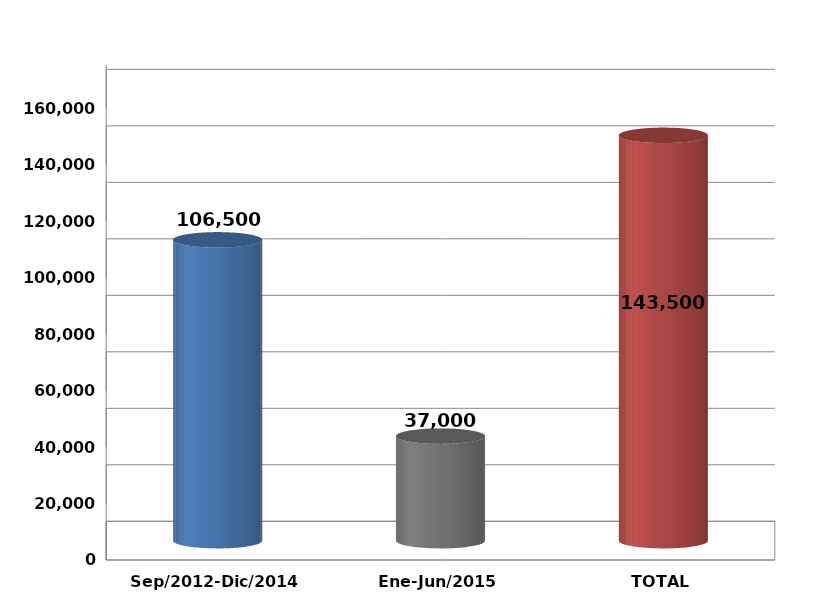
| Category | Series 0 |
|---|---|
| Sep/2012-Dic/2014 | 106500 |
| Ene-Jun/2015 | 37000 |
| TOTAL | 143500 |